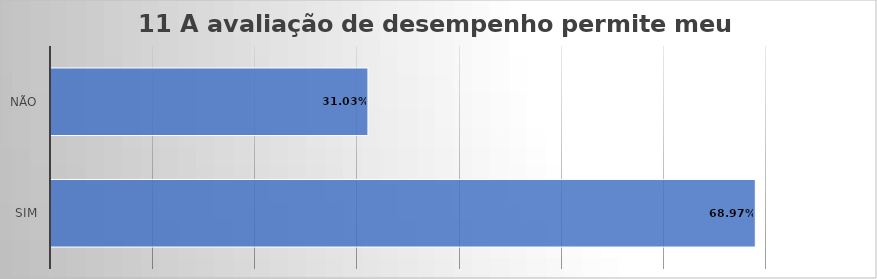
| Category | 11 A avaliação de desempenho permite meu desenvolvimento? |
|---|---|
| Sim | 0.69 |
| Não | 0.31 |